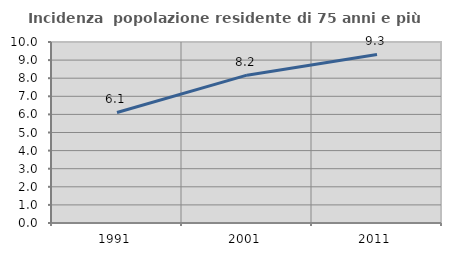
| Category | Incidenza  popolazione residente di 75 anni e più |
|---|---|
| 1991.0 | 6.105 |
| 2001.0 | 8.167 |
| 2011.0 | 9.31 |